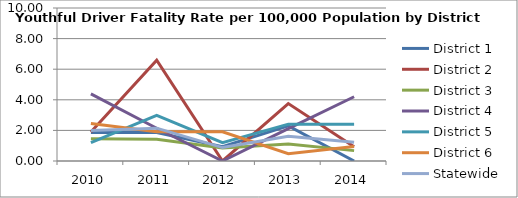
| Category | District 1 | District 2 | District 3 | District 4 | District 5 | District 6 | Statewide |
|---|---|---|---|---|---|---|---|
| 2010.0 | 1.859 | 1.897 | 1.458 | 4.387 | 1.201 | 2.445 | 1.987 |
| 2011.0 | 1.864 | 6.59 | 1.428 | 2.139 | 2.988 | 1.911 | 2.145 |
| 2012.0 | 0.928 | 0 | 0.845 | 0 | 1.199 | 1.909 | 0.877 |
| 2013.0 | 2.298 | 3.753 | 1.107 | 2.118 | 2.408 | 0.475 | 1.613 |
| 2014.0 | 0 | 0.934 | 0.678 | 4.2 | 2.406 | 0.942 | 1.224 |